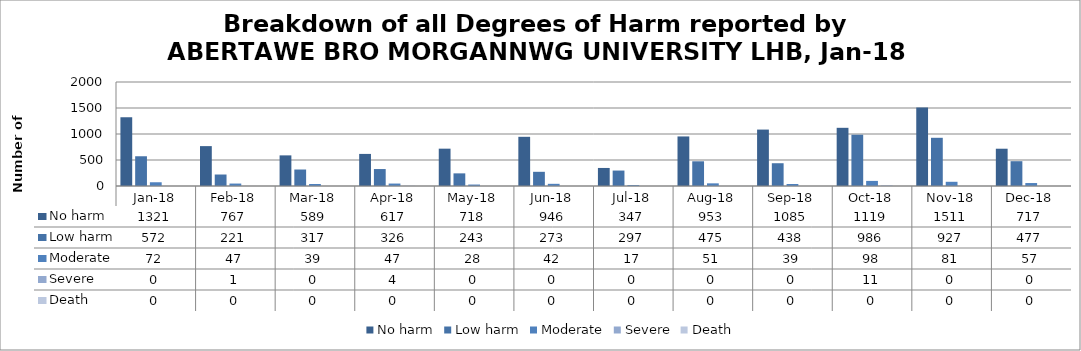
| Category | No harm | Low harm | Moderate | Severe | Death |
|---|---|---|---|---|---|
| Jan-18 | 1321 | 572 | 72 | 0 | 0 |
| Feb-18 | 767 | 221 | 47 | 1 | 0 |
| Mar-18 | 589 | 317 | 39 | 0 | 0 |
| Apr-18 | 617 | 326 | 47 | 4 | 0 |
| May-18 | 718 | 243 | 28 | 0 | 0 |
| Jun-18 | 946 | 273 | 42 | 0 | 0 |
| Jul-18 | 347 | 297 | 17 | 0 | 0 |
| Aug-18 | 953 | 475 | 51 | 0 | 0 |
| Sep-18 | 1085 | 438 | 39 | 0 | 0 |
| Oct-18 | 1119 | 986 | 98 | 11 | 0 |
| Nov-18 | 1511 | 927 | 81 | 0 | 0 |
| Dec-18 | 717 | 477 | 57 | 0 | 0 |